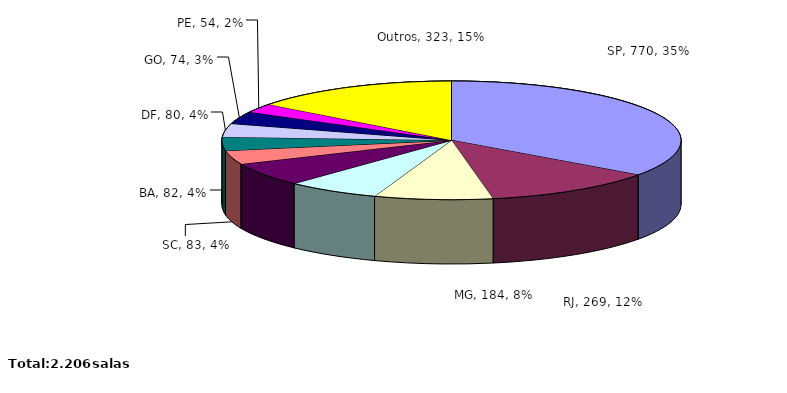
| Category | Series 0 |
|---|---|
| SP | 770 |
| RJ | 269 |
| MG | 184 |
| PR | 145 |
| RS | 142 |
| SC | 83 |
| BA | 82 |
| DF | 80 |
| GO | 74 |
| PE | 54 |
| Outros | 323 |